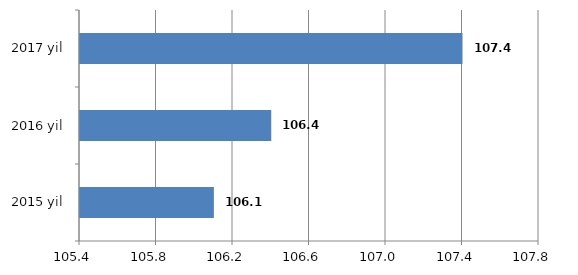
| Category | Series 0 |
|---|---|
| 2015 yil | 106.1 |
| 2016 yil | 106.4 |
| 2017 yil | 107.4 |